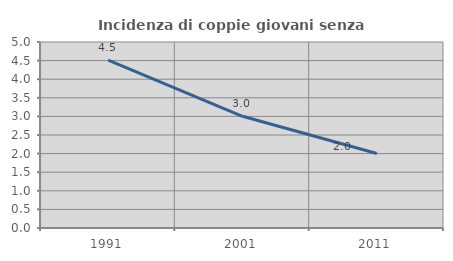
| Category | Incidenza di coppie giovani senza figli |
|---|---|
| 1991.0 | 4.511 |
| 2001.0 | 3.004 |
| 2011.0 | 2.004 |